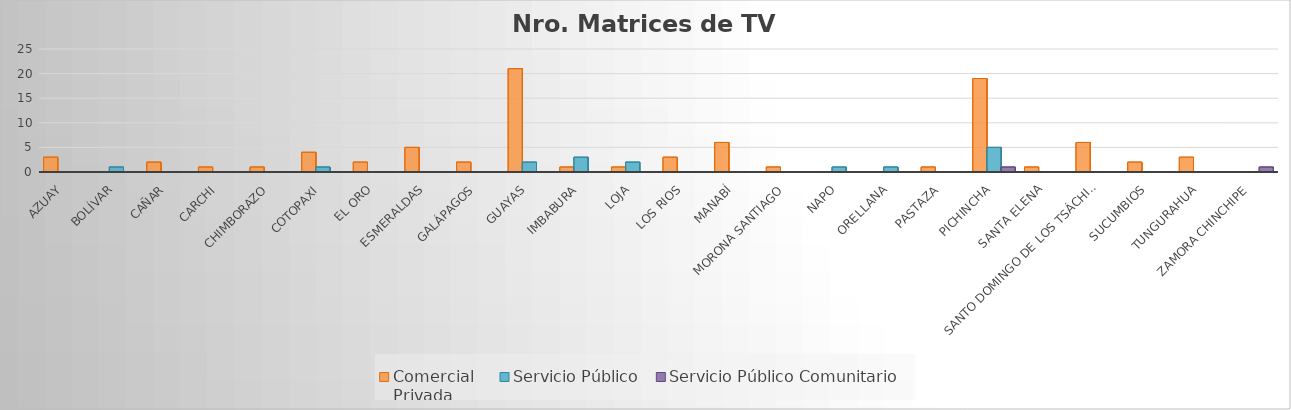
| Category | Comercial 
Privada | Servicio Público | Servicio Público Comunitario |
|---|---|---|---|
| Azuay | 3 | 0 | 0 |
| Bolívar | 0 | 1 | 0 |
| Cañar | 2 | 0 | 0 |
| Carchi | 1 | 0 | 0 |
| Chimborazo | 1 | 0 | 0 |
| Cotopaxi | 4 | 1 | 0 |
| El Oro | 2 | 0 | 0 |
| Esmeraldas | 5 | 0 | 0 |
| Galápagos | 2 | 0 | 0 |
| Guayas | 21 | 2 | 0 |
| Imbabura | 1 | 3 | 0 |
| Loja | 1 | 2 | 0 |
| Los Rios | 3 | 0 | 0 |
| Manabí | 6 | 0 | 0 |
| Morona Santiago | 1 | 0 | 0 |
| Napo | 0 | 1 | 0 |
| Orellana | 0 | 1 | 0 |
| Pastaza | 1 | 0 | 0 |
| Pichincha | 19 | 5 | 1 |
| Santa Elena | 1 | 0 | 0 |
| Santo Domingo de los Tsáchilas | 6 | 0 | 0 |
| Sucumbios | 2 | 0 | 0 |
| Tungurahua | 3 | 0 | 0 |
| Zamora Chinchipe | 0 | 0 | 1 |